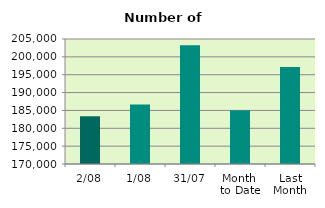
| Category | Series 0 |
|---|---|
| 2/08 | 183360 |
| 1/08 | 186692 |
| 31/07 | 203234 |
| Month 
to Date | 185026 |
| Last
Month | 197154.286 |